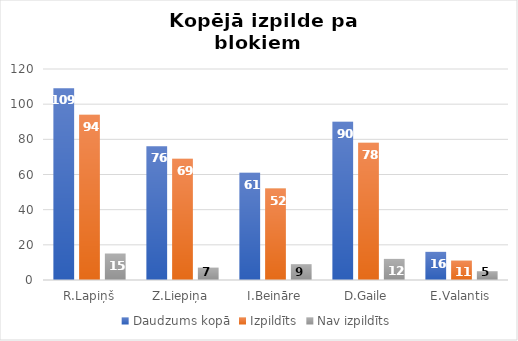
| Category | Daudzums kopā | Izpildīts | Nav izpildīts |
|---|---|---|---|
| R.Lapiņš | 109 | 94 | 15 |
| Z.Liepiņa | 76 | 69 | 7 |
| I.Beināre | 61 | 52 | 9 |
| D.Gaile | 90 | 78 | 12 |
| E.Valantis | 16 | 11 | 5 |